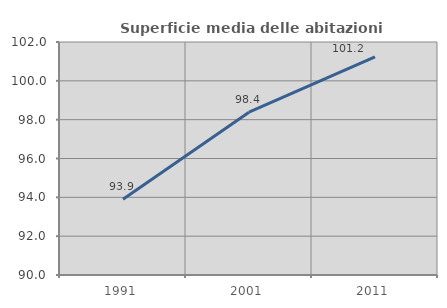
| Category | Superficie media delle abitazioni occupate |
|---|---|
| 1991.0 | 93.906 |
| 2001.0 | 98.384 |
| 2011.0 | 101.24 |